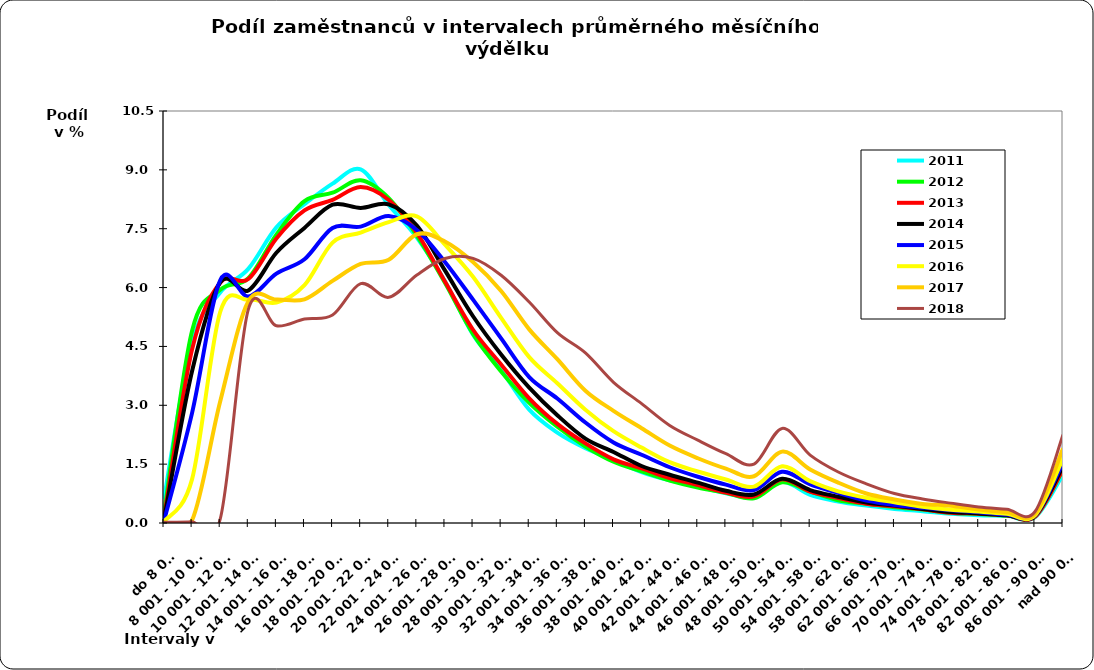
| Category | 2011 | 2012 | 2013 | 2014 | 2015 | 2016 | 2017 | 2018 |
|---|---|---|---|---|---|---|---|---|
| do 8 000 | 0.613 | 0.231 | 0.125 | 0.084 | 0.052 | 0.038 | 0.014 | 0.017 |
| 8 001 - 10 000 | 4.607 | 4.901 | 4.424 | 3.873 | 2.808 | 1.119 | 0.071 | 0.03 |
| 10 001 - 12 000 | 5.872 | 5.941 | 6.126 | 6.134 | 6.187 | 5.377 | 3.096 | 0.097 |
| 12 001 - 14 000 | 6.476 | 6.236 | 6.217 | 5.928 | 5.775 | 5.692 | 5.647 | 5.439 |
| 14 001 - 16 000 | 7.535 | 7.349 | 7.25 | 6.888 | 6.356 | 5.62 | 5.694 | 5.025 |
| 16 001 - 18 000 | 8.125 | 8.203 | 7.966 | 7.521 | 6.72 | 6.063 | 5.702 | 5.2 |
| 18 001 - 20 000 | 8.648 | 8.417 | 8.234 | 8.112 | 7.52 | 7.146 | 6.17 | 5.301 |
| 20 001 - 22 000 | 9.014 | 8.733 | 8.561 | 8.03 | 7.553 | 7.401 | 6.602 | 6.099 |
| 22 001 - 24 000 | 8.106 | 8.278 | 8.233 | 8.12 | 7.821 | 7.668 | 6.708 | 5.751 |
| 24 001 - 26 000 | 7.277 | 7.322 | 7.392 | 7.581 | 7.468 | 7.813 | 7.36 | 6.32 |
| 26 001 - 28 000 | 6.161 | 6.122 | 6.154 | 6.437 | 6.654 | 7.095 | 7.175 | 6.74 |
| 28 001 - 30 000 | 4.802 | 4.819 | 4.925 | 5.269 | 5.692 | 6.275 | 6.65 | 6.745 |
| 30 001 - 32 000 | 3.897 | 3.859 | 4.04 | 4.296 | 4.704 | 5.229 | 5.912 | 6.315 |
| 32 001 - 34 000 | 2.89 | 3.062 | 3.177 | 3.453 | 3.72 | 4.227 | 4.934 | 5.632 |
| 34 001 - 36 000 | 2.305 | 2.453 | 2.526 | 2.747 | 3.173 | 3.563 | 4.175 | 4.852 |
| 36 001 - 38 000 | 1.909 | 1.951 | 2.028 | 2.152 | 2.561 | 2.888 | 3.371 | 4.335 |
| 38 001 - 40 000 | 1.612 | 1.563 | 1.623 | 1.811 | 2.053 | 2.34 | 2.858 | 3.586 |
| 40 001 - 42 000 | 1.298 | 1.318 | 1.392 | 1.452 | 1.739 | 1.923 | 2.415 | 3.042 |
| 42 001 - 44 000 | 1.087 | 1.082 | 1.145 | 1.231 | 1.421 | 1.55 | 1.973 | 2.486 |
| 44 001 - 46 000 | 0.933 | 0.903 | 0.968 | 1.028 | 1.178 | 1.313 | 1.651 | 2.112 |
| 46 001 - 48 000 | 0.758 | 0.773 | 0.774 | 0.82 | 0.977 | 1.108 | 1.386 | 1.767 |
| 48 001 - 50 000 | 0.655 | 0.629 | 0.678 | 0.728 | 0.839 | 0.928 | 1.191 | 1.503 |
| 50 001 - 54 000 | 1.05 | 1.039 | 1.115 | 1.128 | 1.307 | 1.448 | 1.819 | 2.41 |
| 54 001 - 58 000 | 0.719 | 0.8 | 0.797 | 0.839 | 0.985 | 1.067 | 1.365 | 1.73 |
| 58 001 - 62 000 | 0.548 | 0.58 | 0.637 | 0.669 | 0.767 | 0.807 | 1.029 | 1.3 |
| 62 001 - 66 000 | 0.443 | 0.493 | 0.492 | 0.52 | 0.572 | 0.643 | 0.752 | 0.998 |
| 66 001 - 70 000 | 0.36 | 0.401 | 0.424 | 0.443 | 0.458 | 0.53 | 0.6 | 0.751 |
| 70 001 - 74 000 | 0.302 | 0.341 | 0.347 | 0.357 | 0.391 | 0.416 | 0.486 | 0.613 |
| 74 001 - 78 000 | 0.237 | 0.259 | 0.263 | 0.281 | 0.328 | 0.341 | 0.441 | 0.506 |
| 78 001 - 82 000 | 0.198 | 0.229 | 0.237 | 0.245 | 0.276 | 0.293 | 0.343 | 0.41 |
| 82 001 - 86 000 | 0.183 | 0.189 | 0.195 | 0.196 | 0.215 | 0.234 | 0.276 | 0.351 |
| 86 001 - 90 000 | 0.142 | 0.166 | 0.16 | 0.179 | 0.188 | 0.196 | 0.234 | 0.287 |
| nad 90 001 | 1.24 | 1.361 | 1.375 | 1.45 | 1.544 | 1.652 | 1.899 | 2.25 |